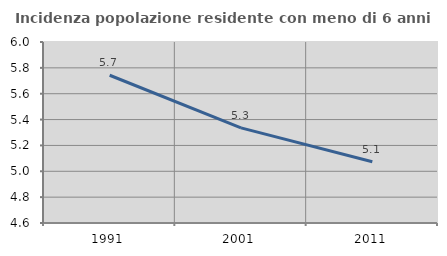
| Category | Incidenza popolazione residente con meno di 6 anni |
|---|---|
| 1991.0 | 5.743 |
| 2001.0 | 5.335 |
| 2011.0 | 5.074 |